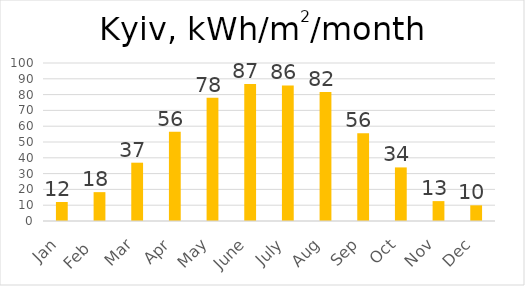
| Category | Kyiv |
|---|---|
| Jan | 12.038 |
| Feb  | 18.265 |
| Mar | 36.905 |
| Apr | 56.421 |
| May | 77.941 |
| June | 86.776 |
| July | 85.774 |
| Aug | 81.689 |
| Sep | 55.52 |
| Oct | 33.915 |
| Nov | 12.586 |
| Dec | 9.917 |